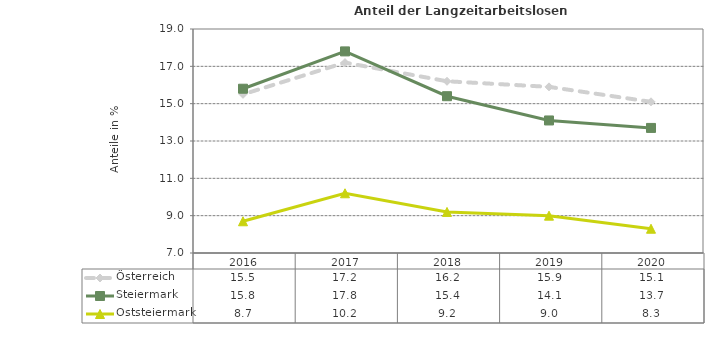
| Category | Österreich | Steiermark | Oststeiermark |
|---|---|---|---|
| 2020.0 | 15.1 | 13.7 | 8.3 |
| 2019.0 | 15.9 | 14.1 | 9 |
| 2018.0 | 16.2 | 15.4 | 9.2 |
| 2017.0 | 17.2 | 17.8 | 10.2 |
| 2016.0 | 15.5 | 15.8 | 8.7 |